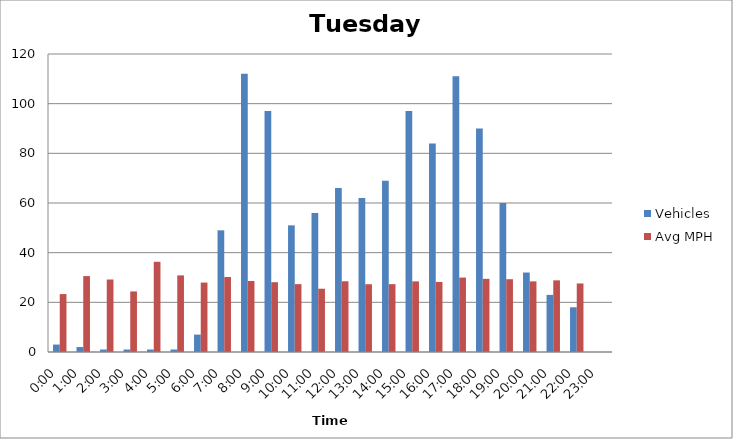
| Category | Vehicles | Avg MPH |
|---|---|---|
| 0:00 | 3 | 23.33 |
| 1:00 | 2 | 30.57 |
| 2:00 | 1 | 29.19 |
| 3:00 | 1 | 24.39 |
| 4:00 | 1 | 36.33 |
| 5:00 | 1 | 30.85 |
| 6:00 | 7 | 27.96 |
| 7:00 | 49 | 30.2 |
| 8:00 | 112 | 28.59 |
| 9:00 | 97 | 28.11 |
| 10:00 | 51 | 27.33 |
| 11:00 | 56 | 25.48 |
| 12:00 | 66 | 28.49 |
| 13:00 | 62 | 27.29 |
| 14:00 | 69 | 27.32 |
| 15:00 | 97 | 28.44 |
| 16:00 | 84 | 28.21 |
| 17:00 | 111 | 29.97 |
| 18:00 | 90 | 29.46 |
| 19:00 | 60 | 29.31 |
| 20:00 | 32 | 28.44 |
| 21:00 | 23 | 28.85 |
| 22:00 | 18 | 27.6 |
| 23:00 | 0 | 0 |